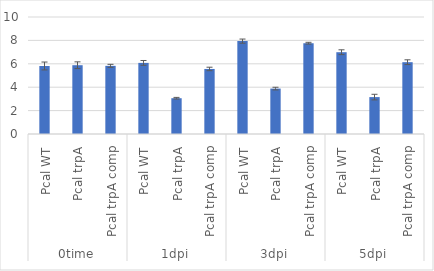
| Category | Series 0 |
|---|---|
| 0 | 5.813 |
| 1 | 5.879 |
| 2 | 5.825 |
| 3 | 6.078 |
| 4 | 3.058 |
| 5 | 5.56 |
| 6 | 7.938 |
| 7 | 3.881 |
| 8 | 7.761 |
| 9 | 6.99 |
| 10 | 3.154 |
| 11 | 6.138 |